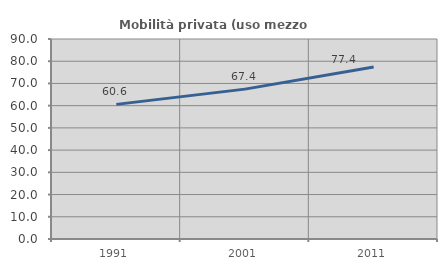
| Category | Mobilità privata (uso mezzo privato) |
|---|---|
| 1991.0 | 60.577 |
| 2001.0 | 67.448 |
| 2011.0 | 77.411 |